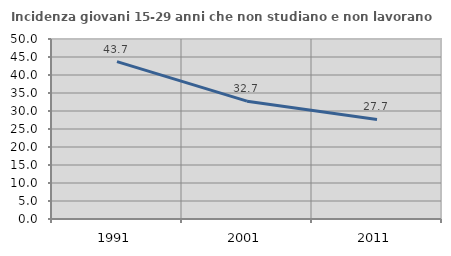
| Category | Incidenza giovani 15-29 anni che non studiano e non lavorano  |
|---|---|
| 1991.0 | 43.715 |
| 2001.0 | 32.732 |
| 2011.0 | 27.652 |